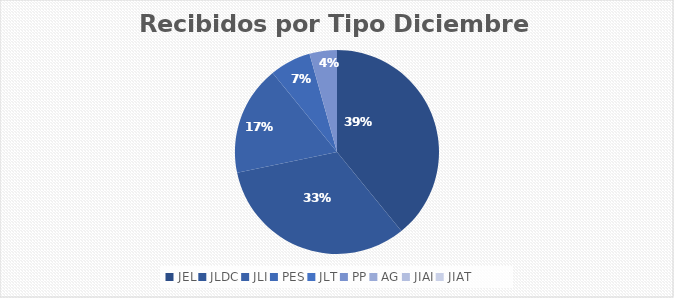
| Category | Series 0 |
|---|---|
| JEL | 18 |
| JLDC | 15 |
| JLI | 8 |
| PES | 3 |
| JLT | 0 |
| PP | 2 |
| AG | 0 |
| JIAI | 0 |
| JIAT | 0 |